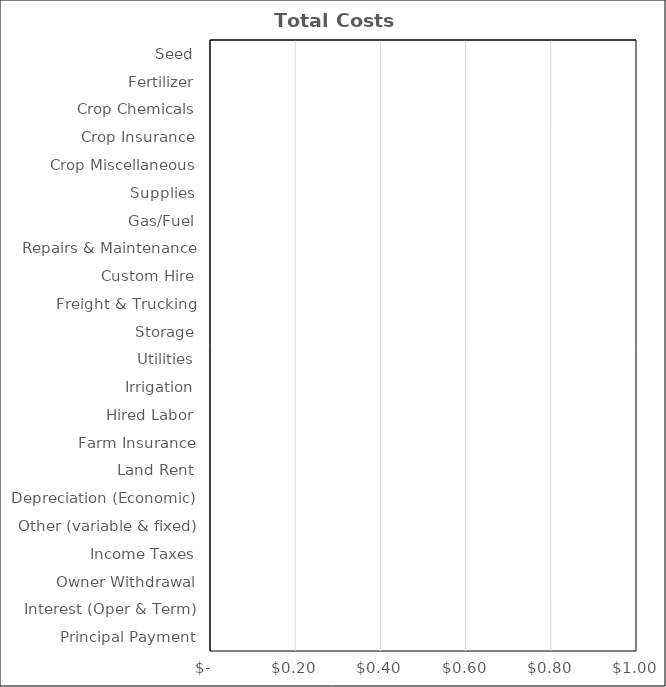
| Category | Alfalfa Hay |
|---|---|
| Seed | 0 |
| Fertilizer | 0 |
| Crop Chemicals | 0 |
| Crop Insurance | 0 |
| Crop Miscellaneous | 0 |
| Supplies | 0 |
| Gas/Fuel | 0 |
| Repairs & Maintenance | 0 |
| Custom Hire | 0 |
| Freight & Trucking | 0 |
| Storage | 0 |
| Utilities | 0 |
| Irrigation | 0 |
| Hired Labor | 0 |
| Farm Insurance | 0 |
| Land Rent | 0 |
| Depreciation (Economic) | 0 |
| Other (variable & fixed) | 0 |
| Income Taxes | 0 |
| Owner Withdrawal | 0 |
| Interest (Oper & Term) | 0 |
| Principal Payment | 0 |